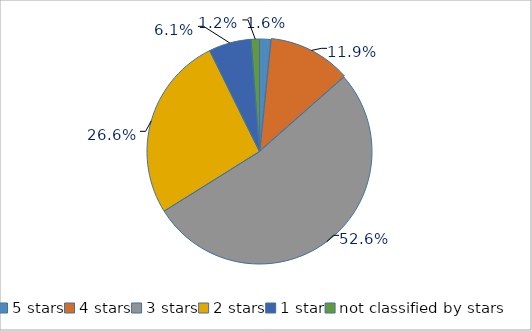
| Category | Series 0 |
|---|---|
| 5 stars | 1.6 |
| 4 stars | 11.9 |
| 3 stars | 52.6 |
| 2 stars | 26.6 |
| 1 star | 6.1 |
| not classified by stars | 1.2 |